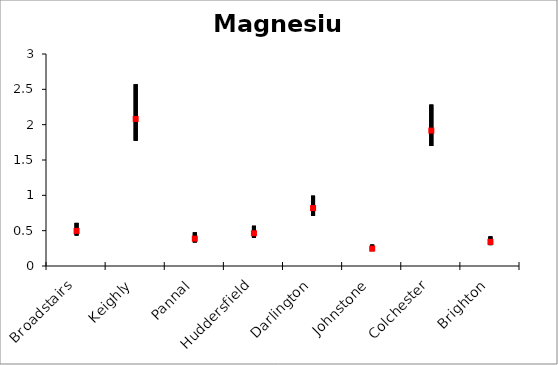
| Category | Magnesium | Series 1 | Series 2 |
|---|---|---|---|
| Broadstairs | 0.61 | 0.431 | 0.497 |
| Keighly | 2.572 | 1.773 | 2.082 |
| Pannal | 0.476 | 0.333 | 0.387 |
| Huddersfield | 0.57 | 0.397 | 0.464 |
| Darlington | 0.995 | 0.708 | 0.82 |
| Johnstone | 0.304 | 0.211 | 0.246 |
| Colchester | 2.284 | 1.698 | 1.916 |
| Brighton | 0.42 | 0.295 | 0.341 |